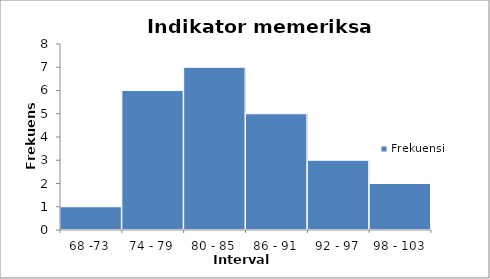
| Category | Frekuensi |
|---|---|
| 68 -73 | 1 |
| 74 - 79 | 6 |
| 80 - 85 | 7 |
| 86 - 91 | 5 |
| 92 - 97 | 3 |
| 98 - 103 | 2 |